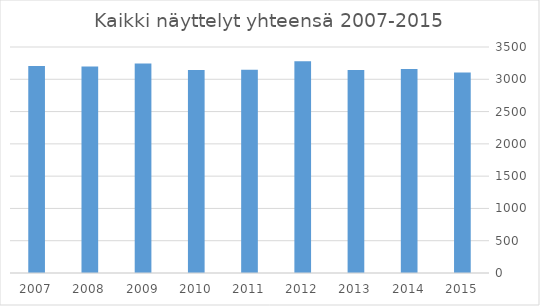
| Category | Kaikki näyttelyt yhteensä |
|---|---|
| 2015.0 | 3104 |
| 2014.0 | 3160 |
| 2013.0 | 3145 |
| 2012.0 | 3279 |
| 2011.0 | 3149 |
| 2010.0 | 3144 |
| 2009.0 | 3244 |
| 2008.0 | 3197 |
| 2007.0 | 3207 |